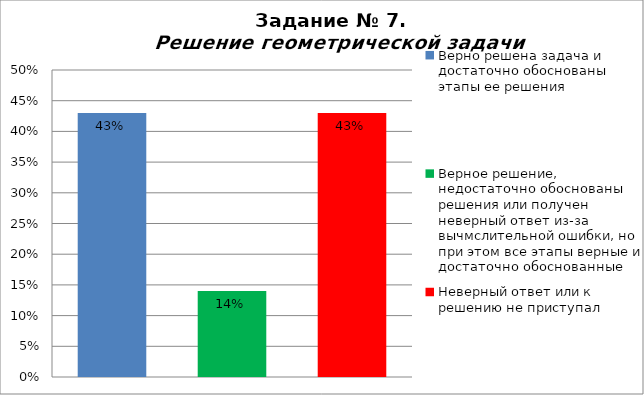
| Category | Решение геометрической задачи  |
|---|---|
| Верно решена задача и достаточно обоснованы этапы ее решения | 0.43 |
| Верное решение, недостаточно обоснованы решения или получен неверный ответ из-за вычмслительной ошибки, но при этом все этапы верные и достаточно обоснованные | 0.14 |
| Неверный ответ или к решению не приступал | 0.43 |